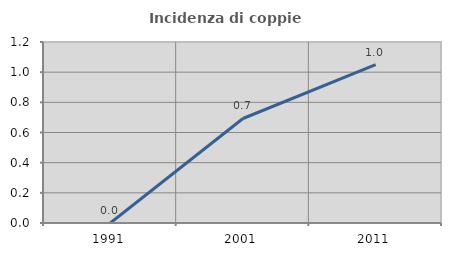
| Category | Incidenza di coppie miste |
|---|---|
| 1991.0 | 0 |
| 2001.0 | 0.693 |
| 2011.0 | 1.05 |